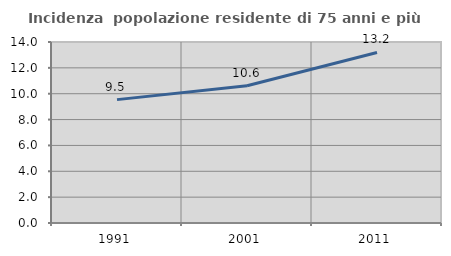
| Category | Incidenza  popolazione residente di 75 anni e più |
|---|---|
| 1991.0 | 9.543 |
| 2001.0 | 10.62 |
| 2011.0 | 13.191 |